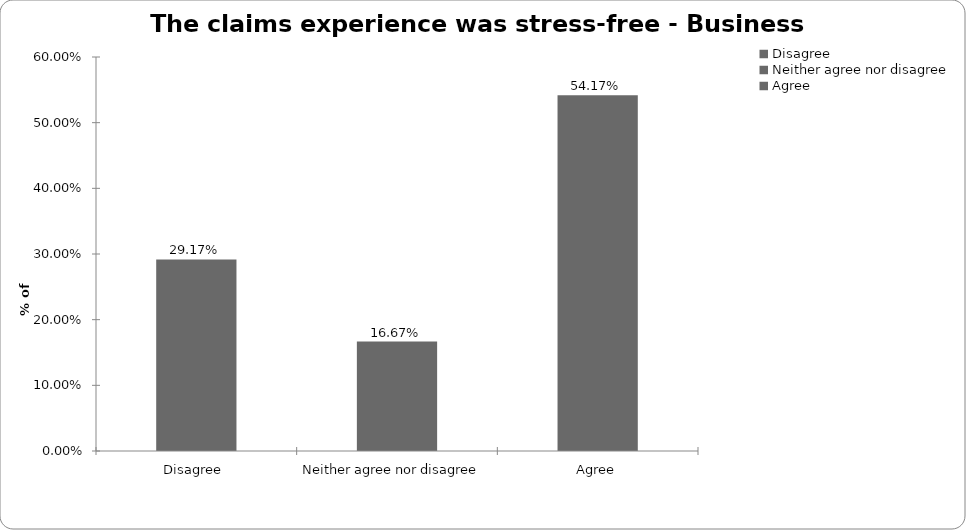
| Category | Business Interruption |
|---|---|
| Disagree  | 0.292 |
| Neither agree nor disagree  | 0.167 |
| Agree | 0.542 |